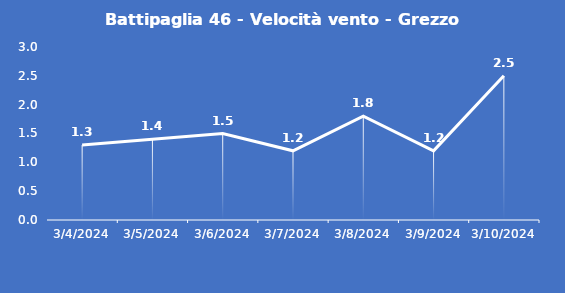
| Category | Battipaglia 46 - Velocità vento - Grezzo (m/s) |
|---|---|
| 3/4/24 | 1.3 |
| 3/5/24 | 1.4 |
| 3/6/24 | 1.5 |
| 3/7/24 | 1.2 |
| 3/8/24 | 1.8 |
| 3/9/24 | 1.2 |
| 3/10/24 | 2.5 |